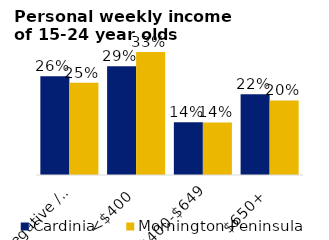
| Category | Cardinia | Mornington Peninsula |
|---|---|---|
| Negative / Nil | 0.264 | 0.246 |
| <$400 | 0.291 | 0.328 |
| $400-$649 | 0.141 | 0.141 |
| $650+ | 0.215 | 0.199 |